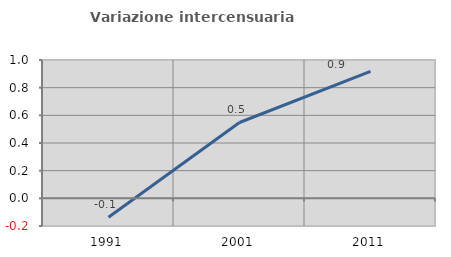
| Category | Variazione intercensuaria annua |
|---|---|
| 1991.0 | -0.137 |
| 2001.0 | 0.548 |
| 2011.0 | 0.918 |